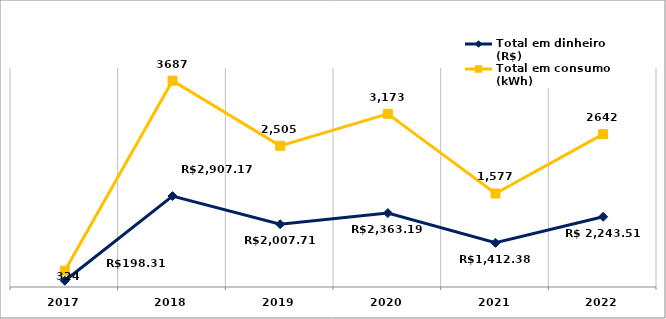
| Category | Total em dinheiro (R$) | Total em consumo (kWh) |
|---|---|---|
| 2017.0 | 198.31 | 324 |
| 2018.0 | 2907.17 | 3687 |
| 2019.0 | 2007.71 | 2505 |
| 2020.0 | 2363.19 | 3173 |
| 2021.0 | 1412.38 | 1577 |
| 2022.0 | 2243.51 | 2642 |